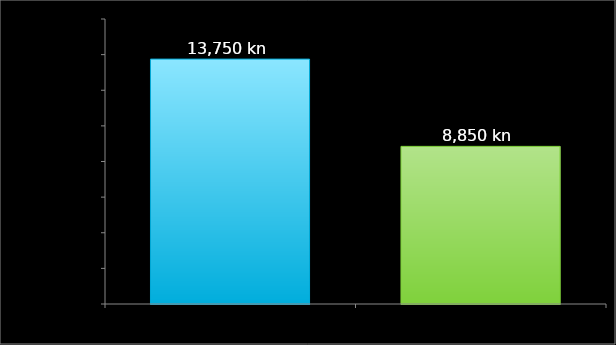
| Category | Series 0 |
|---|---|
| 0 | 13750 |
| 1 | 8850 |